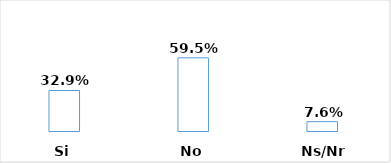
| Category | Series 0 |
|---|---|
| Si | 0.329 |
| No | 0.595 |
| Ns/Nr | 0.076 |